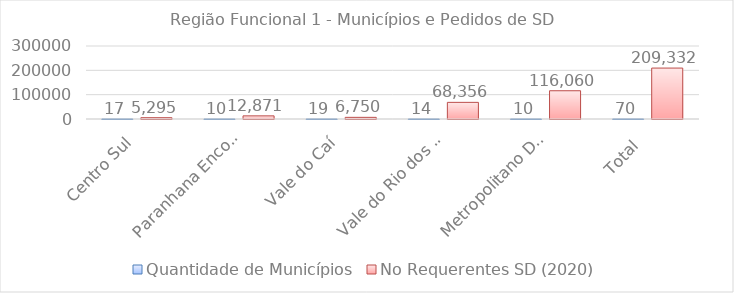
| Category | Quantidade de Municípios | No Requerentes SD (2020) |
|---|---|---|
| Centro Sul | 17 | 5295 |
|  Paranhana Encosta da Serra | 10 | 12871 |
| Vale do Caí | 19 | 6750 |
| Vale do Rio dos Sinos | 14 | 68356 |
|  Metropolitano Delta do Jacuí | 10 | 116060 |
| Total  | 70 | 209332 |